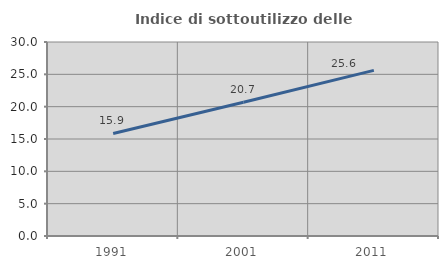
| Category | Indice di sottoutilizzo delle abitazioni  |
|---|---|
| 1991.0 | 15.853 |
| 2001.0 | 20.675 |
| 2011.0 | 25.619 |